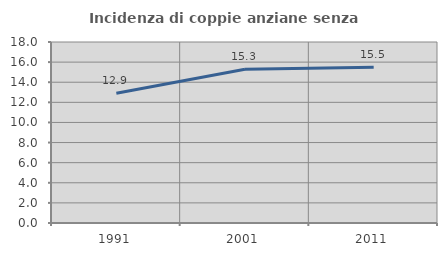
| Category | Incidenza di coppie anziane senza figli  |
|---|---|
| 1991.0 | 12.895 |
| 2001.0 | 15.286 |
| 2011.0 | 15.489 |